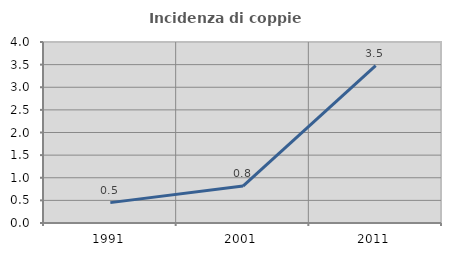
| Category | Incidenza di coppie miste |
|---|---|
| 1991.0 | 0.45 |
| 2001.0 | 0.816 |
| 2011.0 | 3.478 |